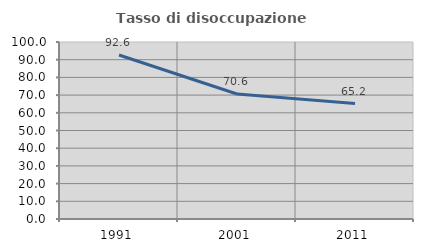
| Category | Tasso di disoccupazione giovanile  |
|---|---|
| 1991.0 | 92.63 |
| 2001.0 | 70.598 |
| 2011.0 | 65.235 |